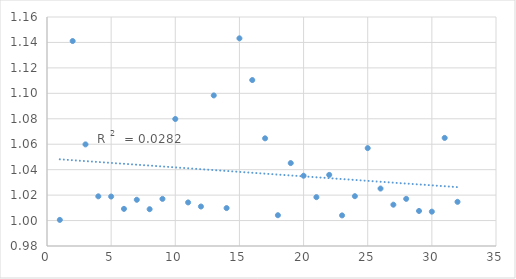
| Category | Series 0 |
|---|---|
| 24.0 | 1.019 |
| 13.0 | 1.098 |
| 7.0 | 1.016 |
| 14.0 | 1.01 |
| 21.0 | 1.018 |
| 11.0 | 1.014 |
| 4.0 | 1.019 |
| 27.0 | 1.012 |
| 18.0 | 1.004 |
| 23.0 | 1.004 |
| 22.0 | 1.036 |
| 26.0 | 1.025 |
| 1.0 | 1.001 |
| 29.0 | 1.008 |
| 32.0 | 1.015 |
| 6.0 | 1.009 |
| 20.0 | 1.035 |
| 10.0 | 1.08 |
| 2.0 | 1.141 |
| 28.0 | 1.017 |
| 5.0 | 1.019 |
| 3.0 | 1.06 |
| 9.0 | 1.017 |
| 25.0 | 1.057 |
| 8.0 | 1.009 |
| 19.0 | 1.045 |
| 16.0 | 1.11 |
| 31.0 | 1.065 |
| 15.0 | 1.143 |
| 12.0 | 1.011 |
| 17.0 | 1.065 |
| 30.0 | 1.007 |